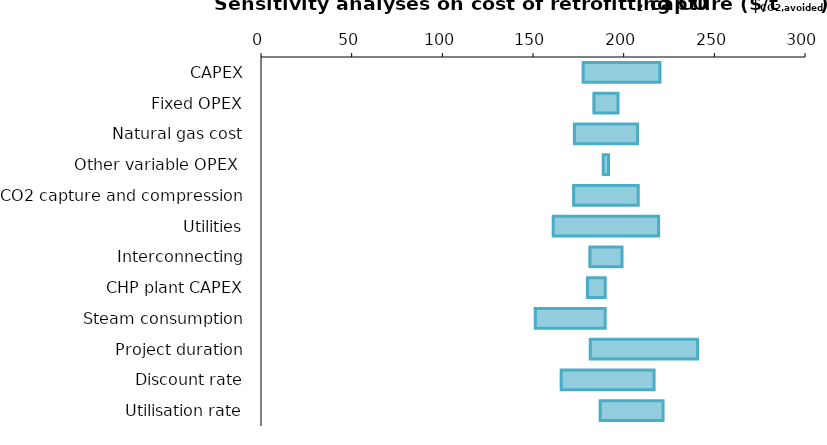
| Category | Minimum value | Increase of the parameter |
|---|---|---|
| CAPEX | 176.877 | 43.128 |
| Fixed OPEX | 182.823 | 13.984 |
| Natural gas cost | 172.017 | 35.596 |
| Other variable OPEX  | 187.961 | 3.709 |
| CO2 capture and compression | 171.596 | 36.437 |
| Utilities | 160.361 | 58.908 |
| Interconnecting | 180.543 | 18.543 |
| CHP plant CAPEX | 179.187 | 10.628 |
| Steam consumption | 150.455 | 39.36 |
| Project duration | 180.774 | 60.006 |
| Discount rate | 164.766 | 51.998 |
| Utilisation rate | 186.27 | 35.448 |